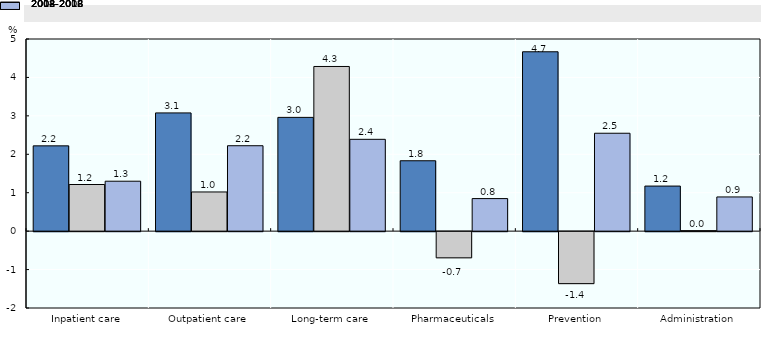
| Category | 2004-2008 | 2008-2012 | 2012-2016 |
|---|---|---|---|
| Inpatient care | 2.22 | 1.214 | 1.299 |
| Outpatient care | 3.077 | 1.02 | 2.223 |
| Long-term care | 2.96 | 4.285 | 2.39 |
| Pharmaceuticals | 1.832 | -0.682 | 0.847 |
| Prevention | 4.668 | -1.353 | 2.547 |
| Administration | 1.173 | 0.012 | 0.89 |